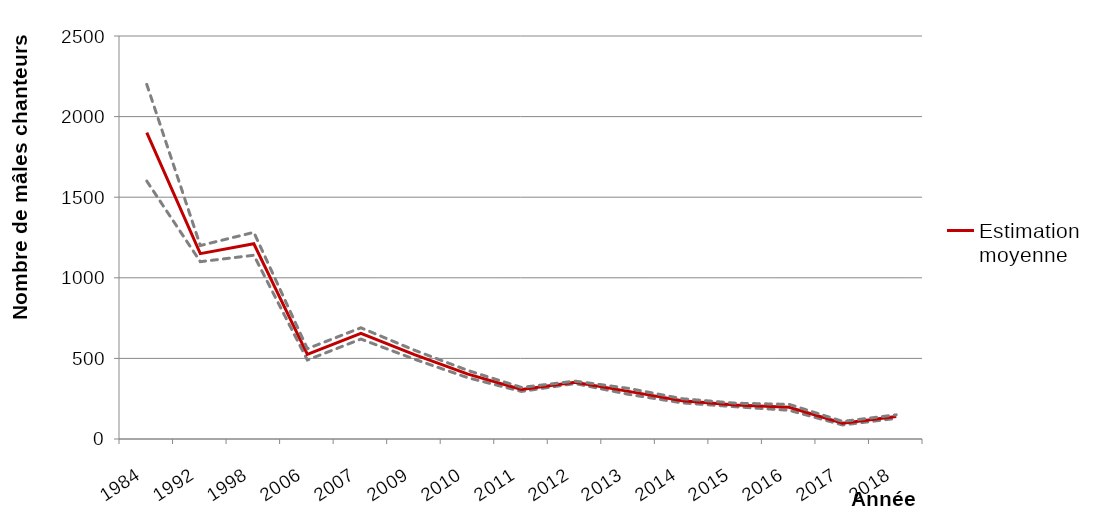
| Category | Estimation basse | Estimation moyenne | Estimation Haute |
|---|---|---|---|
| 1984.0 | 1600 | 1900 | 2200 |
| 1992.0 | 1100 | 1150 | 1200 |
| 1998.0 | 1140 | 1211 | 1282 |
| 2006.0 | 490 | 525 | 560 |
| 2007.0 | 620 | 655 | 690 |
| 2009.0 | 495 | 523 | 551 |
| 2010.0 | 380 | 402.5 | 425 |
| 2011.0 | 295 | 307.5 | 320 |
| 2012.0 | 344 | 351.5 | 359 |
| 2013.0 | 277 | 295.5 | 314 |
| 2014.0 | 224 | 237 | 250 |
| 2015.0 | 200 | 211 | 222 |
| 2016.0 | 178 | 196.5 | 215 |
| 2017.0 | 87 | 98 | 109 |
| 2018.0 | 128 | 139 | 150 |